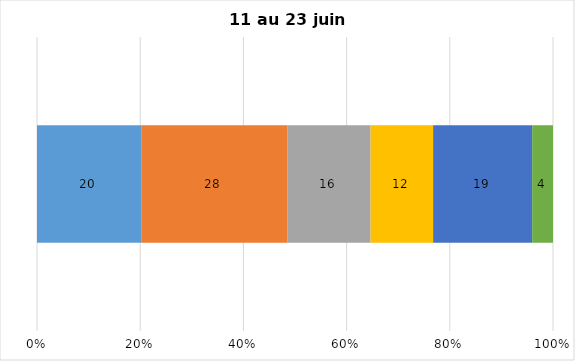
| Category | Plusieurs fois par jour | Une fois par jour | Quelques fois par semaine   | Une fois par semaine ou moins   |  Jamais   |  Je n’utilise pas les médias sociaux |
|---|---|---|---|---|---|---|
| 0 | 20 | 28 | 16 | 12 | 19 | 4 |